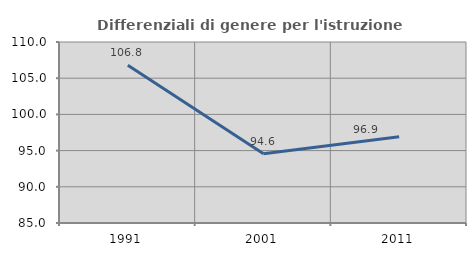
| Category | Differenziali di genere per l'istruzione superiore |
|---|---|
| 1991.0 | 106.778 |
| 2001.0 | 94.573 |
| 2011.0 | 96.925 |